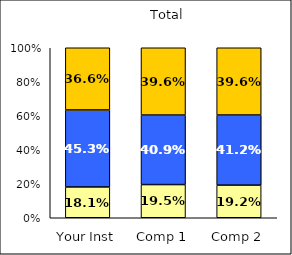
| Category | Low Institutional Priority: Commitment to Diversity | Average Institutional Priority: Commitment to Diversity | High Institutional Priority: Commitment to Diversity |
|---|---|---|---|
| Your Inst | 0.181 | 0.453 | 0.366 |
| Comp 1 | 0.195 | 0.409 | 0.396 |
| Comp 2 | 0.192 | 0.412 | 0.396 |